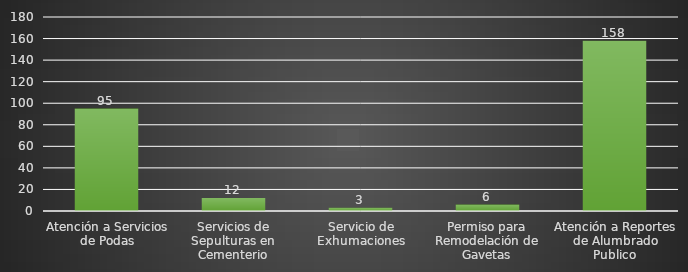
| Category | INDICADOR  |
|---|---|
| Atención a Servicios de Podas | 95 |
| Servicios de Sepulturas en Cementerio | 12 |
| Servicio de Exhumaciones | 3 |
| Permiso para Remodelación de Gavetas | 6 |
| Atención a Reportes de Alumbrado Publico | 158 |